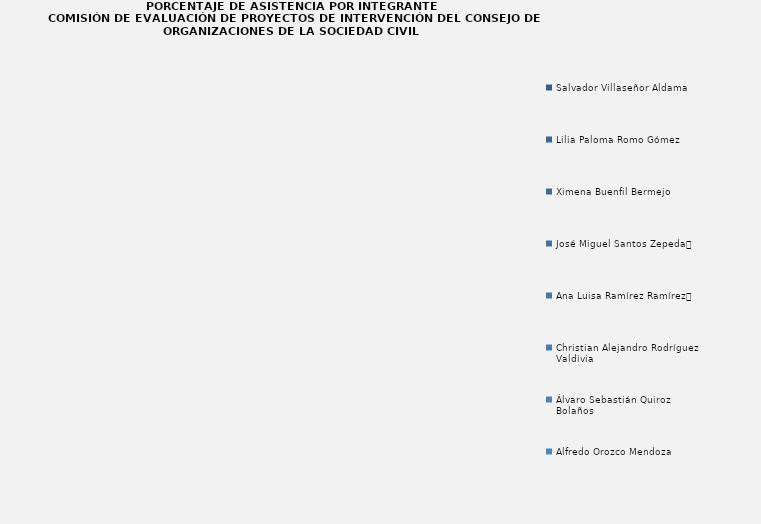
| Category | Salvador Villaseñor Aldama  |
|---|---|
| Salvador Villaseñor Aldama  | 0 |
| Lilia Paloma Romo Gómez  | 0 |
| Ximena Buenfil Bermejo | 0 |
| José Miguel Santos Zepeda	 | 0 |
| Ana Luisa Ramírez Ramírez	 | 0 |
| Christian Alejandro Rodríguez Valdivia  | 0 |
| Álvaro Sebastián Quiroz Bolaños | 0 |
| Alfredo Orozco Mendoza  | 0 |